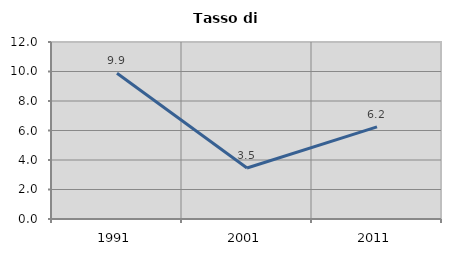
| Category | Tasso di disoccupazione   |
|---|---|
| 1991.0 | 9.887 |
| 2001.0 | 3.457 |
| 2011.0 | 6.245 |